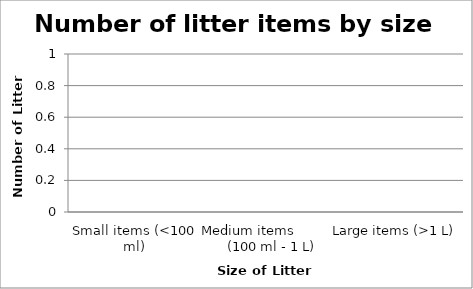
| Category | Series 0 |
|---|---|
| Small items (<100 ml) | 0 |
| Medium items             (100 ml - 1 L) | 0 |
| Large items (>1 L) | 0 |